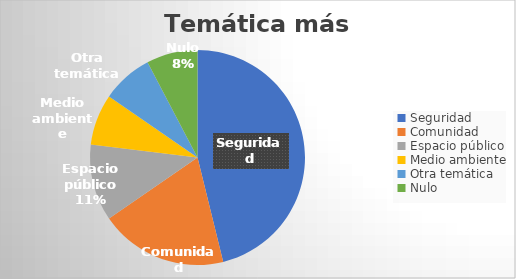
| Category | Series 0 |
|---|---|
| Seguridad | 12 |
| Comunidad | 5 |
| Espacio público | 3 |
| Medio ambiente | 2 |
| Otra temática | 2 |
| Nulo | 2 |